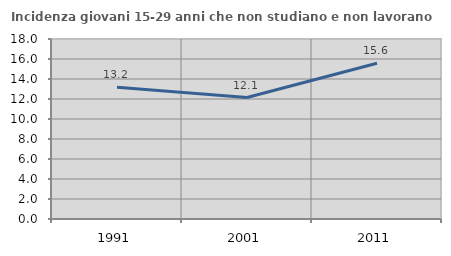
| Category | Incidenza giovani 15-29 anni che non studiano e non lavorano  |
|---|---|
| 1991.0 | 13.18 |
| 2001.0 | 12.147 |
| 2011.0 | 15.579 |